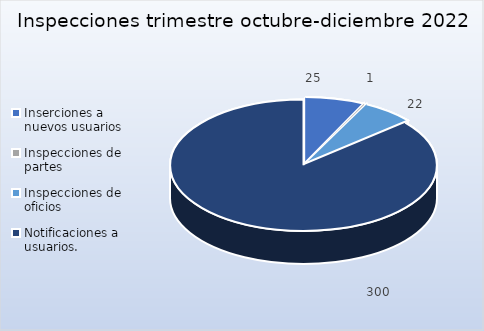
| Category | Cantidad |
|---|---|
| Inserciones a nuevos usuarios  | 25 |
| Inspecciones de partes | 1 |
| Inspecciones de oficios | 22 |
| Notificaciones a usuarios.  | 300 |